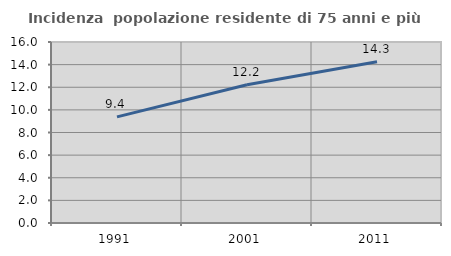
| Category | Incidenza  popolazione residente di 75 anni e più |
|---|---|
| 1991.0 | 9.378 |
| 2001.0 | 12.216 |
| 2011.0 | 14.257 |